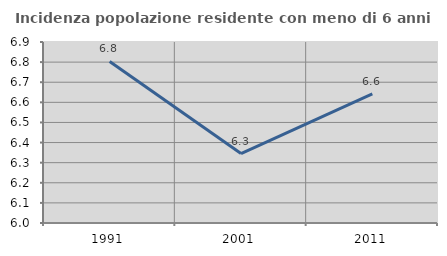
| Category | Incidenza popolazione residente con meno di 6 anni |
|---|---|
| 1991.0 | 6.803 |
| 2001.0 | 6.345 |
| 2011.0 | 6.642 |